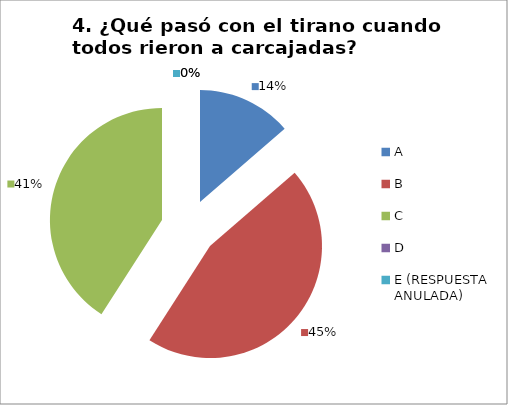
| Category | CANTIDAD DE RESPUESTAS PREGUNTA (4) | PORCENTAJE |
|---|---|---|
| A | 3 | 0.136 |
| B | 10 | 0.455 |
| C | 9 | 0.409 |
| D | 0 | 0 |
| E (RESPUESTA ANULADA) | 0 | 0 |